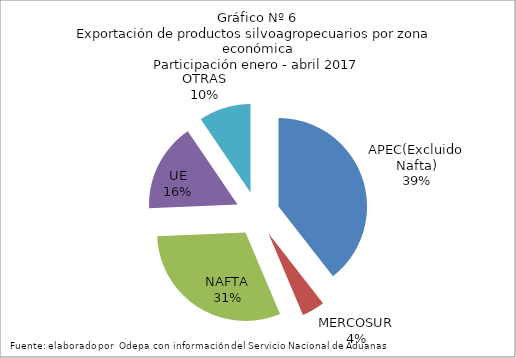
| Category | Series 0 |
|---|---|
| APEC(Excluido Nafta) | 2007115.162 |
| MERCOSUR | 212802.965 |
| NAFTA | 1561527.648 |
| UE | 823080.351 |
| OTRAS | 483397.874 |